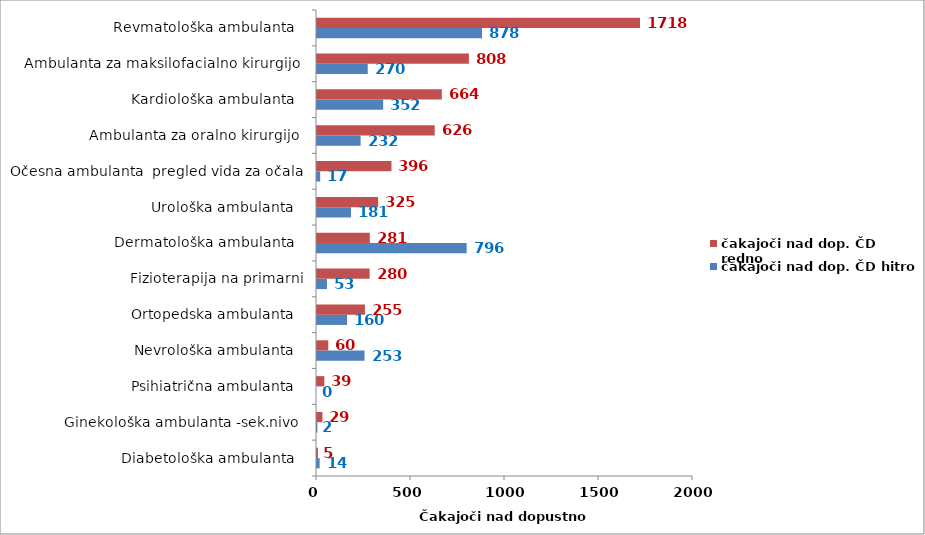
| Category | čakajoči nad dop. ČD hitro | čakajoči nad dop. ČD redno |
|---|---|---|
| Diabetološka ambulanta   | 14 | 5 |
| Ginekološka ambulanta -sek.nivo  | 2 | 29 |
| Psihiatrična ambulanta   | 0 | 39 |
| Nevrološka ambulanta   | 253 | 60 |
| Ortopedska ambulanta   | 160 | 255 |
| Fizioterapija na primarni | 53 | 280 |
| Dermatološka ambulanta   | 796 | 281 |
| Urološka ambulanta   | 181 | 325 |
| Očesna ambulanta  pregled vida za očala | 17 | 396 |
| Ambulanta za oralno kirurgijo  | 232 | 626 |
| Kardiološka ambulanta   | 352 | 664 |
| Ambulanta za maksilofacialno kirurgijo  | 270 | 808 |
| Revmatološka ambulanta   | 878 | 1718 |